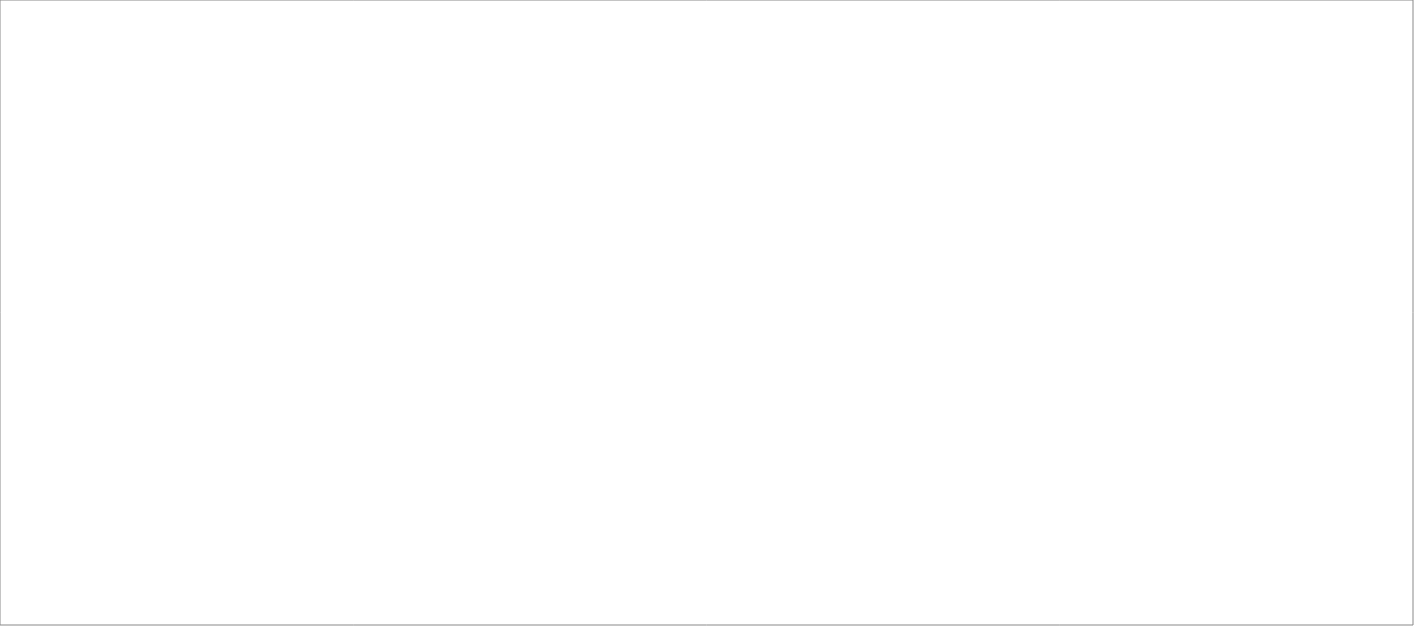
| Category | Total |
|---|---|
| Poolia Sverige AB | 85 |
| Clockwork Bemanning & Rekrytering AB | 83 |
| Randstad AB | 66.869 |
| Experis AB | 49.6 |
| Source Executive Recruitment Sweden AB | 25 |